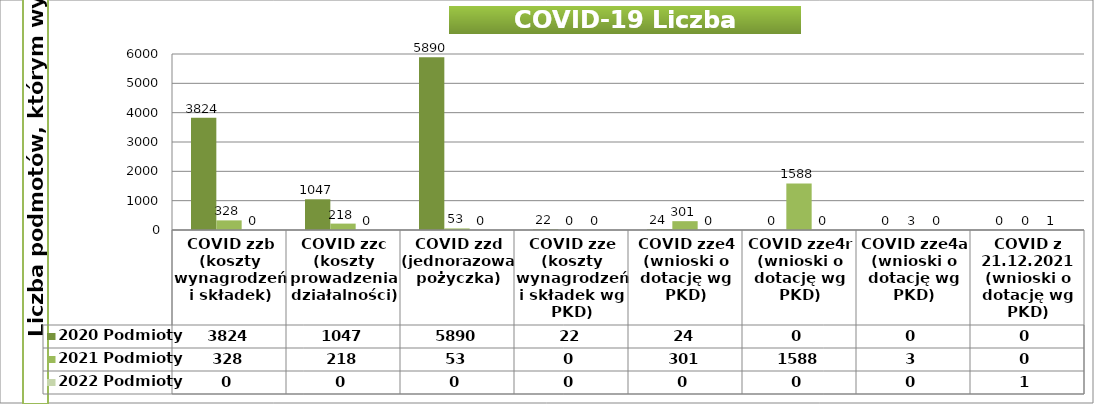
| Category | 2020 Podmioty | 2021 Podmioty | 2022 Podmioty |
|---|---|---|---|
| COVID zzb (koszty wynagrodzeń i składek) | 3824 | 328 | 0 |
| COVID zzc (koszty prowadzenia działalności) | 1047 | 218 | 0 |
| COVID zzd (jednorazowa pożyczka) | 5890 | 53 | 0 |
| COVID zze (koszty wynagrodzeń i składek wg PKD) | 22 | 0 | 0 |
| COVID zze4 (wnioski o dotację wg PKD) | 24 | 301 | 0 |
| COVID zze4r (wnioski o dotację wg PKD) | 0 | 1588 | 0 |
| COVID zze4a (wnioski o dotację wg PKD) | 0 | 3 | 0 |
| COVID z 21.12.2021 (wnioski o dotację wg PKD) | 0 | 0 | 1 |